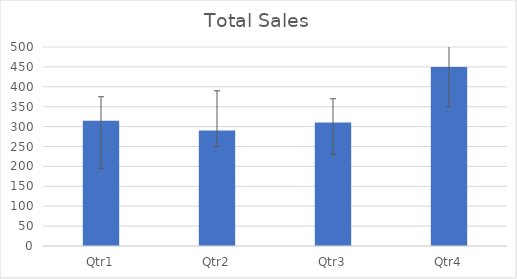
| Category | Total Sales |
|---|---|
| Qtr1 | 315 |
| Qtr2 | 290 |
| Qtr3 | 310 |
| Qtr4 | 450 |